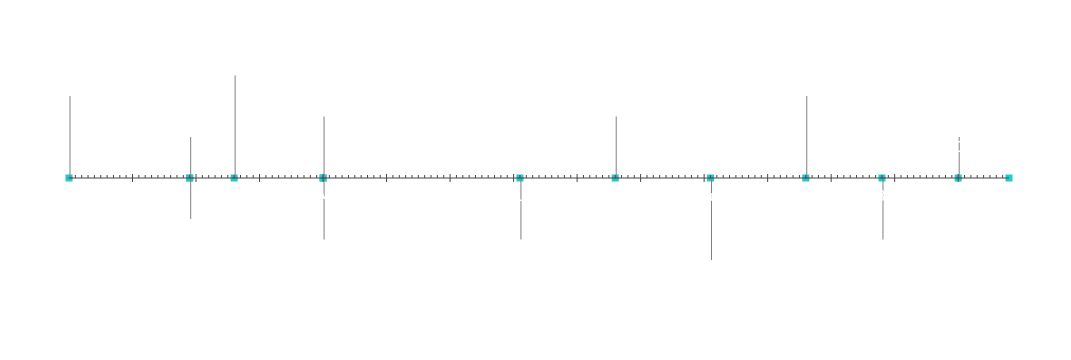
| Category | Position |
|---|---|
| Début du projet | 20 |
| Jalon 1 | 10 |
| Jalon 2 | -10 |
| Jalon 3 | 25 |
| Jalon 4 | -15 |
| Jalon 5 | 15 |
| Jalon 6 | -15 |
| Jalon 7 | 15 |
| Jalon 8 | -20 |
| Jalon 9 | 20 |
| Jalon 10 | -15 |
| Jalon 11 | 10 |
| Fin du projet | 5 |